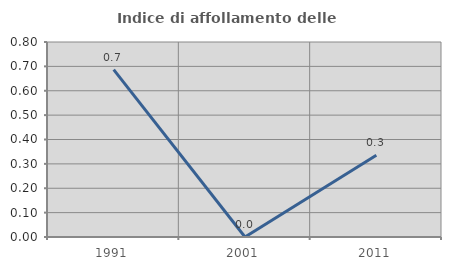
| Category | Indice di affollamento delle abitazioni  |
|---|---|
| 1991.0 | 0.687 |
| 2001.0 | 0 |
| 2011.0 | 0.335 |